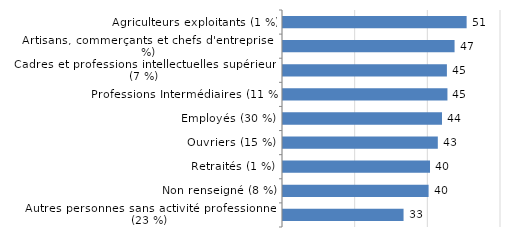
| Category | Taux d'emploi |
|---|---|
| Agriculteurs exploitants (1 %) | 50.54 |
| Artisans, commerçants et chefs d'entreprise (4 %) | 47.22 |
| Cadres et professions intellectuelles supérieures (7 %) | 45.11 |
| Professions Intermédiaires (11 %) | 45.26 |
| Employés (30 %) | 43.76 |
| Ouvriers (15 %) | 42.61 |
| Retraités (1 %) | 40.46 |
| Non renseigné (8 %) | 40.07 |
| Autres personnes sans activité professionnelle (23 %) | 33.18 |